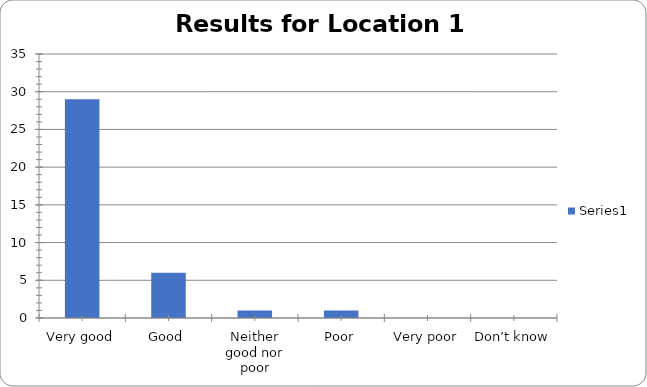
| Category | Series 0 |
|---|---|
| Very good | 29 |
| Good | 6 |
| Neither good nor poor | 1 |
| Poor | 1 |
| Very poor | 0 |
| Don’t know | 0 |